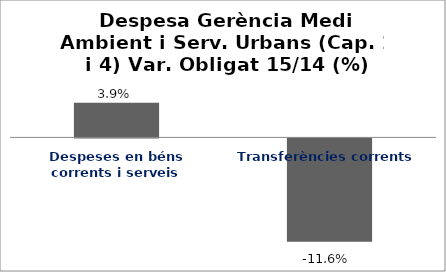
| Category | Series 0 |
|---|---|
| Despeses en béns corrents i serveis | 0.039 |
| Transferències corrents | -0.116 |